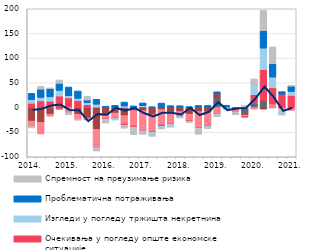
| Category | Други фактори | Трошкови извора за кредите | Конкуренција осталих банака | Очекивања у погледу опште економске ситуације | Изгледи у погледу тржишта некретнина | Проблематична потраживања | Спремност на преузимање ризика |
|---|---|---|---|---|---|---|---|
| 2014. | 0.064 | -27.614 | -10.883 | 8.513 | 7.366 | 12.572 | -2.931 |
|  | 0 | -30.154 | -23.565 | 13.381 | 6.958 | 16.79 | 5.591 |
|  | 0 | -13.58 | -4.04 | 12.84 | 8.698 | 16.68 | 1.322 |
|  | 0 | -3.194 | -0.943 | 23.215 | 11.346 | 14.413 | 6.815 |
| 2015. | 0 | 1.584 | -10.634 | 17.798 | 4.391 | 17.665 | -4.309 |
|  | 0 | -13.709 | -9.748 | 14.011 | 4.433 | 14.906 | -2.291 |
|  | 0 | -21.32 | -4.036 | 5.521 | 4.364 | 5.262 | 7.435 |
|  | 0 | -44.371 | -37.787 | 0.672 | 5.886 | 9.984 | -6.068 |
| 2016. | 0 | -13.683 | -9.865 | -0.183 | -2.017 | 2.537 | -5.896 |
|  | 0 | -11.339 | -9.602 | -0.197 | -1.974 | 4.34 | -2.332 |
|  | 0 | -16.54 | -16.708 | -2.652 | 2.885 | 8.061 | -6.073 |
|  | 0 | -6.439 | -30.804 | -2.596 | -1.957 | 3.101 | -13.396 |
| 2017. | 1.137 | -6.563 | -40.484 | -0.096 | 2.394 | 5.669 | -7.434 |
|  | 0 | -14.708 | -34.121 | -1.211 | -2.234 | 1.309 | -6.144 |
|  | 0 | -4.365 | -31.359 | -2.483 | -2.033 | 8.902 | -3.307 |
|  | 0 | -9.63 | -23.589 | -0.294 | -2.083 | 3.686 | -4.267 |
| 2018. | 0 | -8.401 | -9.465 | -0.308 | -2.087 | 3.545 | -0.758 |
|  | 0 | -13.817 | -13.719 | -0.384 | -1.143 | 1.627 | -1.188 |
|  | 0 | -8.391 | -32.723 | -0.405 | -2.001 | 3.96 | -10.656 |
|  | 0 | -8.386 | -28.581 | -0.415 | -2.043 | 4.097 | -3.682 |
| 2019. | 19.953 | 7.614 | -12.529 | -0.41 | -2.062 | 4.174 | -3.764 |
|  | 0 | -0.003 | 0 | -0.494 | 0 | 4.55 | -3.594 |
|  | 0 | -3.529 | -4.583 | -0.546 | 0 | 0 | -6.275 |
|  | -12.056 | -3.387 | -3.387 | -0.556 | 0 | 0 | 3.746 |
| 2020. | 8.2 | 0 | -3.3 | 17.776 | 18.324 | 0 | 13.5 |
|  | 13.5 | -3.3 | 0 | 63.053 | 43.711 | 35.524 | 40.8 |
|  | -0.7 | 0 | 7.2 | 32.599 | 21.695 | 27.071 | 34.2 |
|  | -0.411 | -0.778 | -3.063 | 26.746 | -8.12 | 5.298 | -3.047 |
| 2021. | -0.834 | 0 | -5.032 | 24.468 | 7.975 | 11.008 | 0.658 |